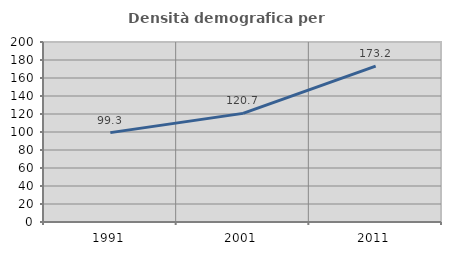
| Category | Densità demografica |
|---|---|
| 1991.0 | 99.305 |
| 2001.0 | 120.679 |
| 2011.0 | 173.194 |